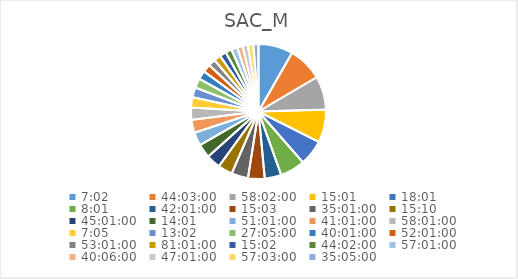
| Category | Series 0 |
|---|---|
| 0.29305555555555557 | 7.441 |
| 1.8354166666666665 | 7.441 |
| 2.4180555555555556 | 7.231 |
| 0.6256944444444444 | 7.092 |
| 0.7506944444444444 | 5.513 |
| 0.3340277777777778 | 5.378 |
| 1.7506944444444443 | 3.587 |
| 0.6270833333333333 | 3.587 |
| 1.4590277777777778 | 3.587 |
| 0.6319444444444444 | 3.133 |
| 1.8756944444444443 | 3.068 |
| 0.5840277777777778 | 3.004 |
| 2.1256944444444446 | 2.875 |
| 1.7090277777777778 | 2.811 |
| 2.417361111111111 | 2.618 |
| 0.2951388888888889 | 2.236 |
| 0.5430555555555555 | 2.109 |
| 1.128472222222222 | 2.046 |
| 1.667361111111111 | 1.856 |
| 2.167361111111111 | 1.731 |
| 2.2090277777777776 | 1.542 |
| 3.3756944444444446 | 1.48 |
| 0.6263888888888889 | 1.417 |
| 1.8347222222222221 | 1.355 |
| 2.3756944444444446 | 1.292 |
| 1.6708333333333334 | 1.168 |
| 1.9590277777777778 | 1.168 |
| 2.377083333333333 | 1.168 |
| 1.4618055555555556 | 1.106 |